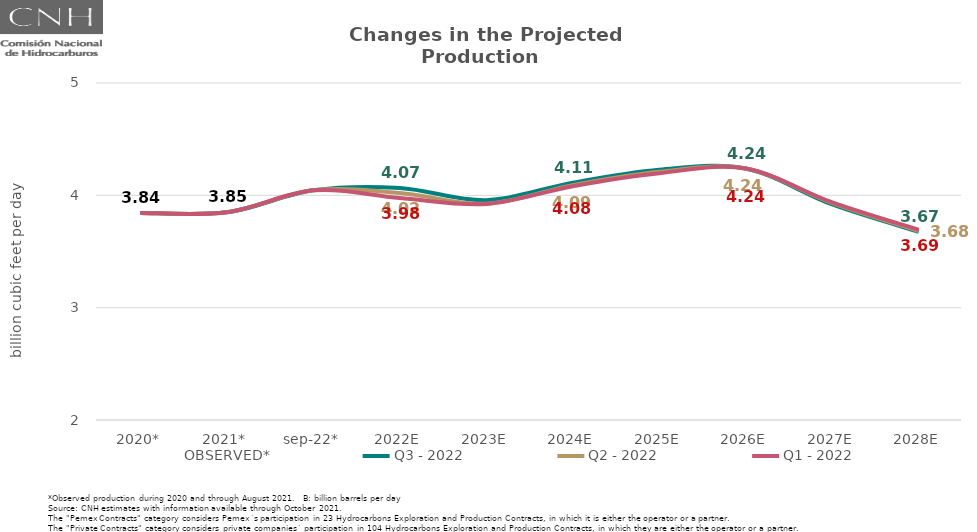
| Category | OBSERVED* | Q3 - 2022 | Q2 - 2022 | Q1 - 2022 |
|---|---|---|---|---|
| 2020* | 3.843 | 3.843 | 3.843 | 3.843 |
| 2021* | 3.849 | 3.849 | 3.849 | 3.849 |
| sep-22* | 4.045 | 4.045 | 4.045 | 4.045 |
| 2022E | 4.066 | 4.066 | 4.022 | 3.977 |
| 2023E | 3.956 | 3.956 | 3.926 | 3.924 |
| 2024E | 4.113 | 4.113 | 4.091 | 4.082 |
| 2025E | 4.227 | 4.227 | 4.21 | 4.197 |
| 2026E | 4.239 | 4.239 | 4.239 | 4.239 |
| 2027E | 3.919 | 3.919 | 3.931 | 3.937 |
| 2028E | 3.675 | 3.675 | 3.681 | 3.693 |